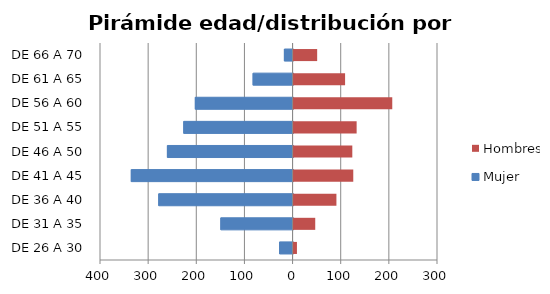
| Category | Mujer | Hombres |
|---|---|---|
| DE 26 A 30 | -28 | 7 |
| DE 31 A 35 | -150 | 45 |
| DE 36 A 40 | -279 | 89 |
| DE 41 A 45 | -336 | 124 |
| DE 46 A 50 | -261 | 122 |
| DE 51 A 55 | -227 | 131 |
| DE 56 A 60 | -203 | 205 |
| DE 61 A 65 | -83 | 107 |
| DE 66 A 70 | -18 | 49 |